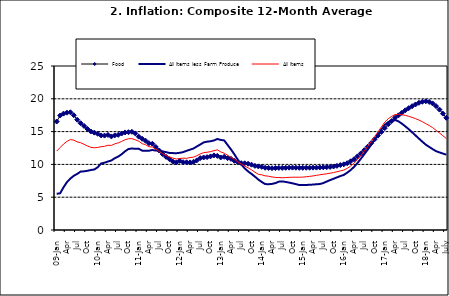
| Category | Food | All Items less Farm Produce | All Items |
|---|---|---|---|
| 09-Jan | 16.536 | 5.519 | 12.032 |
| Feb | 17.454 | 5.591 | 12.567 |
| Mar | 17.742 | 6.51 | 13.101 |
| Apr | 17.89 | 7.302 | 13.51 |
| May | 17.949 | 7.847 | 13.787 |
| June | 17.498 | 8.259 | 13.694 |
| Jul | 16.808 | 8.554 | 13.437 |
| Aug | 16.278 | 8.906 | 13.307 |
| Sep | 15.859 | 8.942 | 13.065 |
| Oct | 15.396 | 9.024 | 12.803 |
| Nov | 15.018 | 9.143 | 12.609 |
| Dec | 14.841 | 9.226 | 12.538 |
| 10-Jan | 14.668 | 9.567 | 12.586 |
| Feb | 14.411 | 10.138 | 12.7 |
| Mar | 14.395 | 10.269 | 12.757 |
| Apr | 14.489 | 10.444 | 12.915 |
| May | 14.266 | 10.597 | 12.893 |
| Jun | 14.424 | 10.948 | 13.132 |
| Jul | 14.514 | 11.193 | 13.284 |
| Aug | 14.706 | 11.549 | 13.5 |
| Sep | 14.872 | 11.997 | 13.764 |
| Oct | 14.906 | 12.345 | 13.908 |
| Nov | 14.967 | 12.423 | 13.928 |
| Dec | 14.723 | 12.383 | 13.74 |
| 11-Jan | 14.233 | 12.385 | 13.542 |
| Feb | 13.903 | 12.099 | 13.161 |
| Mar | 13.606 | 12.077 | 13.001 |
| Apr | 13.227 | 12.088 | 12.694 |
| May | 13.152 | 12.198 | 12.648 |
| Jun | 12.654 | 12.1 | 12.321 |
| Jul | 12.118 | 12.109 | 12.009 |
| Aug | 11.575 | 11.98 | 11.635 |
| Sep | 11.155 | 11.877 | 11.363 |
| Oct | 10.797 | 11.746 | 11.13 |
| Nov | 10.422 | 11.721 | 10.952 |
| Dec | 10.298 | 11.706 | 10.826 |
| 12-Jan | 10.538 | 11.765 | 10.886 |
| 12-Feb | 10.336 | 11.872 | 10.955 |
| 12-Mar | 10.325 | 12.075 | 10.914 |
| Apr | 10.304 | 12.242 | 11.054 |
| May | 10.387 | 12.419 | 11.096 |
| Jun | 10.617 | 12.732 | 11.32 |
| Jul | 10.963 | 13.032 | 11.599 |
| Aug | 11.056 | 13.349 | 11.791 |
| Sep | 11.104 | 13.467 | 11.859 |
| Oct | 11.216 | 13.525 | 11.948 |
| Nov | 11.372 | 13.649 | 12.091 |
| Dec | 11.296 | 13.873 | 12.224 |
| 13-Jan | 11.055 | 13.737 | 11.908 |
| Feb | 11.153 | 13.657 | 11.703 |
| Mar | 10.951 | 12.963 | 11.394 |
| Apr | 10.844 | 12.281 | 11.072 |
| May | 10.548 | 11.531 | 10.761 |
| Jun | 10.352 | 10.704 | 10.383 |
| Jul | 10.186 | 10.005 | 10.047 |
| Aug | 10.168 | 9.4 | 9.761 |
| Sep | 10.105 | 8.939 | 9.486 |
| Oct | 9.955 | 8.553 | 9.167 |
| Nov | 9.774 | 8.136 | 8.815 |
| Dec | 9.695 | 7.691 | 8.496 |
| 14-Jan | 9.626 | 7.317 | 8.408 |
| Feb | 9.484 | 7.005 | 8.257 |
| Mar | 9.464 | 6.976 | 8.19 |
| Apr | 9.416 | 7.03 | 8.092 |
| May | 9.448 | 7.151 | 8.012 |
| Jun | 9.464 | 7.369 | 7.998 |
| Jul | 9.459 | 7.411 | 7.968 |
| Aug | 9.481 | 7.325 | 7.996 |
| Sep | 9.501 | 7.228 | 8.027 |
| Oct | 9.508 | 7.116 | 8.047 |
| Nov | 9.492 | 6.991 | 8.046 |
| Dec | 9.481 | 6.854 | 8.047 |
| 15-Jan | 9.475 | 6.865 | 8.063 |
| Feb | 9.486 | 6.852 | 8.117 |
| Mar | 9.495 | 6.905 | 8.176 |
| Apr | 9.501 | 6.922 | 8.243 |
| May | 9.51 | 6.975 | 8.331 |
| Jun | 9.535 | 7.006 | 8.417 |
| Jul | 9.552 | 7.154 | 8.497 |
| Aug | 9.571 | 7.384 | 8.566 |
| Sep | 9.614 | 7.605 | 8.658 |
| Oct | 9.68 | 7.812 | 8.76 |
| Nov | 9.778 | 8.016 | 8.879 |
| Dec | 9.898 | 8.222 | 9.009 |
| 16-Jan | 10.017 | 8.391 | 9.13 |
| Feb | 10.184 | 8.732 | 9.386 |
| Mar | 10.471 | 9.132 | 9.751 |
| Apr | 10.786 | 9.614 | 10.182 |
| May | 11.221 | 10.196 | 10.746 |
| Jun | 11.672 | 10.864 | 11.372 |
| Jul | 12.162 | 11.553 | 12.045 |
| Aug | 12.696 | 12.247 | 12.744 |
| Sep | 13.238 | 12.98 | 13.454 |
| Oct | 13.817 | 13.757 | 14.206 |
| Nov | 14.386 | 14.542 | 14.958 |
| Dec | 14.946 | 15.307 | 15.697 |
| 17-Jan | 15.536 | 16.042 | 16.441 |
| Feb | 16.127 | 16.436 | 16.958 |
| Mar | 16.598 | 16.682 | 17.315 |
| Apr | 17.106 | 16.772 | 17.591 |
| May | 17.477 | 16.567 | 17.628 |
| Jun | 17.868 | 16.219 | 17.578 |
| Jul | 18.247 | 15.798 | 17.475 |
| Aug | 18.569 | 15.372 | 17.331 |
| Sep | 18.876 | 14.903 | 17.17 |
| Oct | 19.14 | 14.415 | 16.968 |
| Nov | 19.392 | 13.93 | 16.76 |
| Dec | 19.546 | 13.458 | 16.502 |
| 18-Jan | 19.621 | 13.01 | 16.215 |
| Feb | 19.521 | 12.668 | 15.93 |
| Mar | 19.294 | 12.33 | 15.599 |
| Apr | 18.886 | 12.021 | 15.196 |
| May | 18.359 | 11.828 | 14.793 |
| June | 17.745 | 11.651 | 14.371 |
| July | 17.102 | 11.478 | 13.95 |